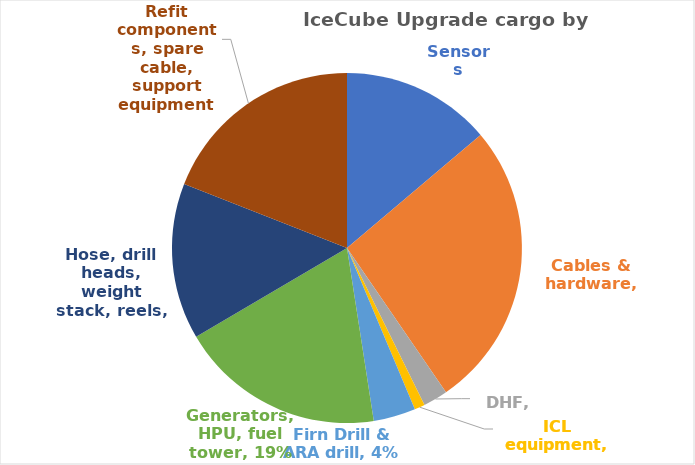
| Category | Series 0 |
|---|---|
| Sensors | 73027 |
| Cables & hardware | 140616 |
| DHF | 12000 |
| ICL equipment | 5075 |
| Firn Drill & ARA drill | 20568 |
| Generators, HPU, fuel tower | 100341 |
| Hose, drill heads, weight stack, reels | 76171 |
| Refit components, spare cable, support equipment | 100628 |